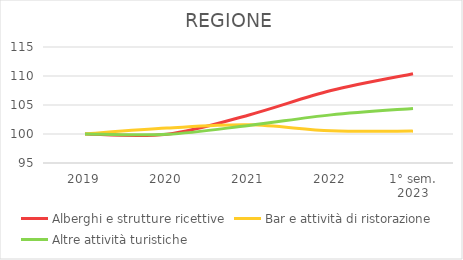
| Category | Alberghi e strutture ricettive | Bar e attività di ristorazione | Altre attività turistiche |
|---|---|---|---|
| 2019 | 100 | 100 | 100 |
| 2020 | 99.97 | 101.023 | 99.941 |
| 2021 | 103.286 | 101.577 | 101.483 |
| 2022 | 107.49 | 100.557 | 103.297 |
| 1° sem.
2023 | 110.391 | 100.495 | 104.4 |